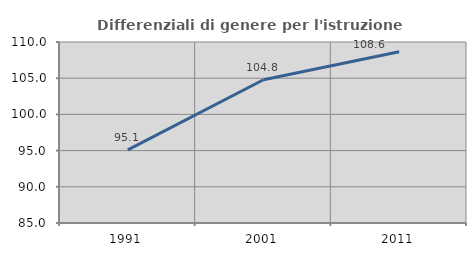
| Category | Differenziali di genere per l'istruzione superiore |
|---|---|
| 1991.0 | 95.101 |
| 2001.0 | 104.787 |
| 2011.0 | 108.65 |